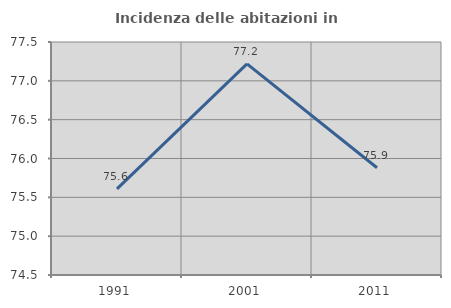
| Category | Incidenza delle abitazioni in proprietà  |
|---|---|
| 1991.0 | 75.61 |
| 2001.0 | 77.219 |
| 2011.0 | 75.881 |